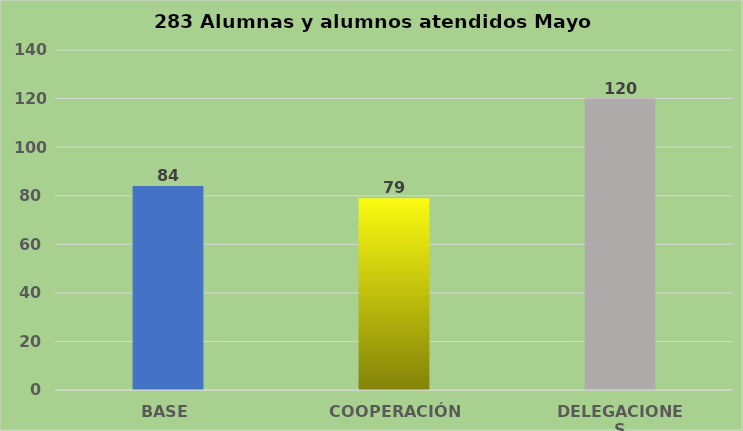
| Category | Series 0 |
|---|---|
| BASE | 84 |
| COOPERACIÓN | 79 |
| DELEGACIONES | 120 |